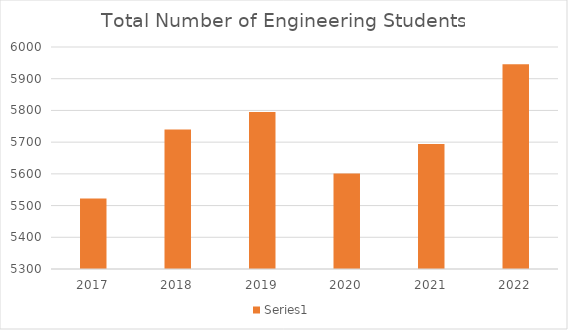
| Category | Series 1 |
|---|---|
| 2017.0 | 5522 |
| 2018.0 | 5740 |
| 2019.0 | 5795 |
| 2020.0 | 5601 |
| 2021.0 | 5694 |
| 2022.0 | 5946 |